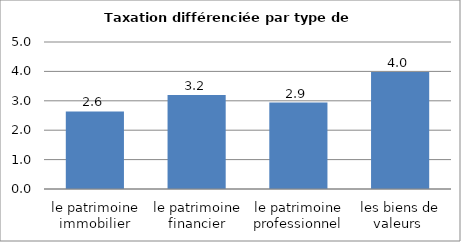
| Category | Total |
|---|---|
| le patrimoine immobilier | 2.64 |
| le patrimoine financier | 3.2 |
| le patrimoine professionnel | 2.94 |
| les biens de valeurs  | 3.98 |